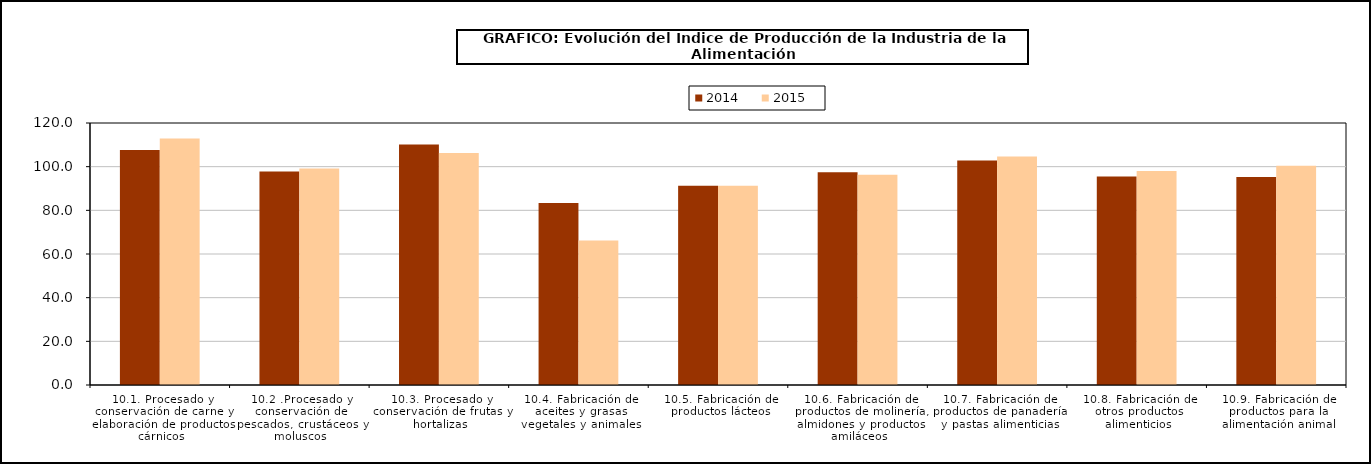
| Category | 2014 | 2015 |
|---|---|---|
| 10.1. Procesado y conservación de carne y elaboración de productos cárnicos | 107.603 | 112.88 |
| 10.2 .Procesado y conservación de pescados, crustáceos y moluscos | 97.837 | 99.216 |
| 10.3. Procesado y conservación de frutas y hortalizas | 110.096 | 106.252 |
| 10.4. Fabricación de aceites y grasas vegetales y animales | 83.369 | 66.169 |
| 10.5. Fabricación de productos lácteos | 91.222 | 91.313 |
| 10.6. Fabricación de productos de molinería, almidones y productos amiláceos | 97.442 | 96.309 |
| 10.7. Fabricación de productos de panadería y pastas alimenticias | 102.782 | 104.604 |
| 10.8. Fabricación de otros productos alimenticios | 95.544 | 97.961 |
| 10.9. Fabricación de productos para la alimentación animal | 95.242 | 100.438 |